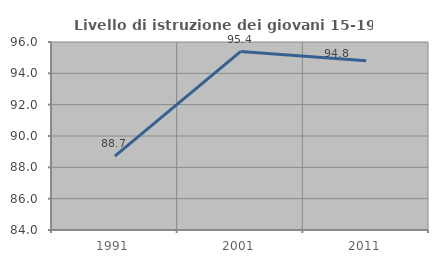
| Category | Livello di istruzione dei giovani 15-19 anni |
|---|---|
| 1991.0 | 88.71 |
| 2001.0 | 95.392 |
| 2011.0 | 94.798 |